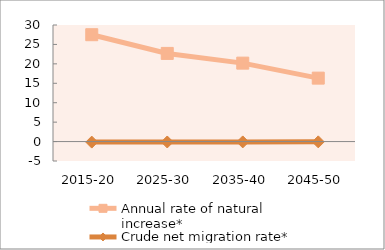
| Category | Annual rate of natural increase* | Crude net migration rate* |
|---|---|---|
| 2015-20 | 27.5 | -0.138 |
| 2025-30 | 22.687 | -0.108 |
| 2035-40 | 20.185 | -0.087 |
| 2045-50 | 16.328 | -0.073 |